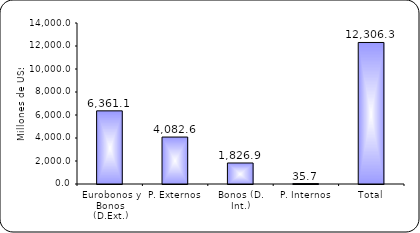
| Category | Series 1 |
|---|---|
| Eurobonos y Bonos (D.Ext.) | 6361.1 |
| P. Externos | 4082.6 |
| Bonos (D. Int.) | 1826.9 |
| P. Internos | 35.7 |
| Total | 12306.3 |